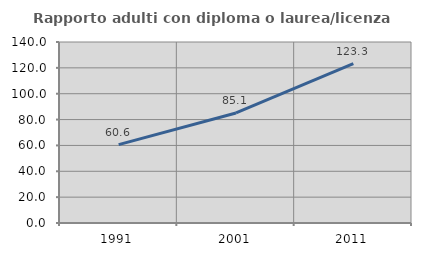
| Category | Rapporto adulti con diploma o laurea/licenza media  |
|---|---|
| 1991.0 | 60.587 |
| 2001.0 | 85.134 |
| 2011.0 | 123.285 |